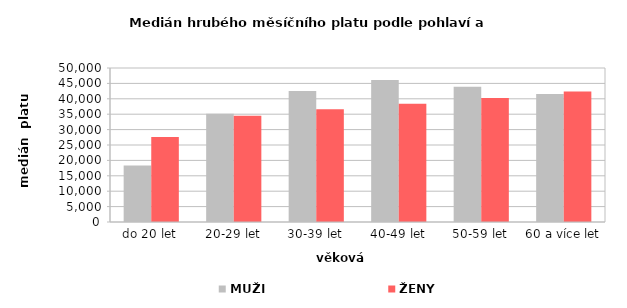
| Category | MUŽI | ŽENY |
|---|---|---|
| 0 | 18320.694 | 27601.112 |
| 1 | 35119.811 | 34460.42 |
| 2 | 42561.183 | 36630.832 |
| 3 | 46135.592 | 38432.92 |
| 4 | 43900.48 | 40273.545 |
| 5 | 41534.061 | 42350.14 |